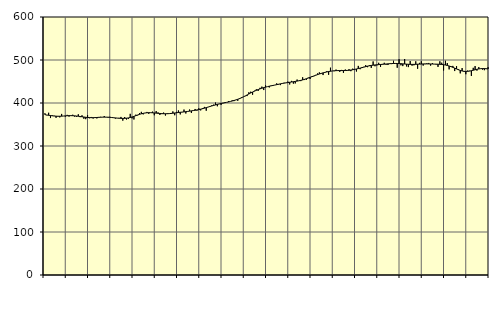
| Category | Piggar | Series 1 |
|---|---|---|
| nan | 376.1 | 372.93 |
| 1.0 | 371.6 | 372.08 |
| 1.0 | 377.3 | 371.46 |
| 1.0 | 365 | 370.79 |
| 1.0 | 371.3 | 370.2 |
| 1.0 | 370.3 | 369.71 |
| 1.0 | 365.6 | 369.36 |
| 1.0 | 368.5 | 369.21 |
| 1.0 | 366.6 | 369.21 |
| 1.0 | 374.6 | 369.39 |
| 1.0 | 369.8 | 369.68 |
| 1.0 | 368.3 | 370.06 |
| nan | 372.4 | 370.38 |
| 2.0 | 368.4 | 370.58 |
| 2.0 | 371.1 | 370.6 |
| 2.0 | 372.7 | 370.45 |
| 2.0 | 368.4 | 370.15 |
| 2.0 | 368.1 | 369.72 |
| 2.0 | 373.7 | 369.2 |
| 2.0 | 367.1 | 368.63 |
| 2.0 | 371.4 | 368.02 |
| 2.0 | 363.4 | 367.39 |
| 2.0 | 362.4 | 366.8 |
| 2.0 | 371.8 | 366.33 |
| nan | 364.6 | 366.01 |
| 3.0 | 367.5 | 365.87 |
| 3.0 | 363.9 | 365.89 |
| 3.0 | 365.9 | 366.05 |
| 3.0 | 364.1 | 366.31 |
| 3.0 | 367.5 | 366.62 |
| 3.0 | 367.8 | 366.88 |
| 3.0 | 366.8 | 367.06 |
| 3.0 | 369.6 | 367.14 |
| 3.0 | 366.8 | 367.11 |
| 3.0 | 366 | 366.99 |
| 3.0 | 367.9 | 366.71 |
| nan | 365.8 | 366.27 |
| 4.0 | 366.3 | 365.79 |
| 4.0 | 363.8 | 365.31 |
| 4.0 | 365.1 | 364.89 |
| 4.0 | 365.3 | 364.54 |
| 4.0 | 367.6 | 364.28 |
| 4.0 | 359 | 364.18 |
| 4.0 | 367.4 | 364.29 |
| 4.0 | 361.6 | 364.66 |
| 4.0 | 362.7 | 365.33 |
| 4.0 | 374.8 | 366.31 |
| 4.0 | 364.3 | 367.54 |
| nan | 361.7 | 369 |
| 5.0 | 372.8 | 370.56 |
| 5.0 | 371.2 | 372.12 |
| 5.0 | 376.7 | 373.6 |
| 5.0 | 379.4 | 374.91 |
| 5.0 | 373.5 | 375.97 |
| 5.0 | 376.7 | 376.76 |
| 5.0 | 379.2 | 377.28 |
| 5.0 | 374.8 | 377.51 |
| 5.0 | 377.7 | 377.48 |
| 5.0 | 379.9 | 377.23 |
| 5.0 | 371.5 | 376.84 |
| nan | 381.2 | 376.42 |
| 6.0 | 378.1 | 376 |
| 6.0 | 372.3 | 375.6 |
| 6.0 | 374.3 | 375.29 |
| 6.0 | 377.7 | 375.06 |
| 6.0 | 370.8 | 374.97 |
| 6.0 | 376.2 | 375.07 |
| 6.0 | 375.4 | 375.31 |
| 6.0 | 374.4 | 375.71 |
| 6.0 | 380.4 | 376.22 |
| 6.0 | 371.5 | 376.78 |
| 6.0 | 379.3 | 377.36 |
| nan | 382.7 | 377.9 |
| 7.0 | 373.5 | 378.4 |
| 7.0 | 378.5 | 378.88 |
| 7.0 | 384.7 | 379.35 |
| 7.0 | 375.6 | 379.86 |
| 7.0 | 380 | 380.42 |
| 7.0 | 384.8 | 381.04 |
| 7.0 | 376.8 | 381.7 |
| 7.0 | 382.6 | 382.39 |
| 7.0 | 386.1 | 383.09 |
| 7.0 | 382.2 | 383.84 |
| 7.0 | 387.7 | 384.7 |
| nan | 382.8 | 385.68 |
| 8.0 | 388 | 386.77 |
| 8.0 | 390.9 | 387.98 |
| 8.0 | 382.1 | 389.25 |
| 8.0 | 390.6 | 390.55 |
| 8.0 | 392.4 | 391.87 |
| 8.0 | 394.6 | 393.15 |
| 8.0 | 396.2 | 394.39 |
| 8.0 | 401 | 395.59 |
| 8.0 | 392.4 | 396.73 |
| 8.0 | 397.6 | 397.79 |
| 8.0 | 395.6 | 398.78 |
| nan | 400.2 | 399.7 |
| 9.0 | 401.6 | 400.6 |
| 9.0 | 401.5 | 401.52 |
| 9.0 | 404.2 | 402.48 |
| 9.0 | 403.6 | 403.51 |
| 9.0 | 406.1 | 404.63 |
| 9.0 | 404.4 | 405.85 |
| 9.0 | 406.9 | 407.17 |
| 9.0 | 405.1 | 408.65 |
| 9.0 | 411.4 | 410.3 |
| 9.0 | 413.4 | 412.15 |
| 9.0 | 413.9 | 414.19 |
| nan | 415.8 | 416.37 |
| 10.0 | 416.1 | 418.64 |
| 10.0 | 424.9 | 420.94 |
| 10.0 | 426.3 | 423.22 |
| 10.0 | 419.2 | 425.42 |
| 10.0 | 428.5 | 427.51 |
| 10.0 | 431.9 | 429.45 |
| 10.0 | 428.1 | 431.24 |
| 10.0 | 435.3 | 432.88 |
| 10.0 | 438 | 434.38 |
| 10.0 | 430.1 | 435.73 |
| 10.0 | 440.9 | 436.95 |
| nan | 437.9 | 438.04 |
| 11.0 | 436.2 | 439.03 |
| 11.0 | 440.6 | 439.93 |
| 11.0 | 440.4 | 440.8 |
| 11.0 | 441.7 | 441.72 |
| 11.0 | 445.7 | 442.68 |
| 11.0 | 442.8 | 443.63 |
| 11.0 | 441.6 | 444.56 |
| 11.0 | 444.9 | 445.41 |
| 11.0 | 447.1 | 446.16 |
| 11.0 | 446.7 | 446.86 |
| 11.0 | 449.8 | 447.52 |
| nan | 443.2 | 448.17 |
| 12.0 | 451.4 | 448.82 |
| 12.0 | 445 | 449.51 |
| 12.0 | 445.5 | 450.22 |
| 12.0 | 454.5 | 450.96 |
| 12.0 | 451.7 | 451.75 |
| 12.0 | 450.9 | 452.64 |
| 12.0 | 459.8 | 453.72 |
| 12.0 | 453.4 | 455.01 |
| 12.0 | 453.9 | 456.44 |
| 12.0 | 458.9 | 458.02 |
| 12.0 | 455.8 | 459.65 |
| nan | 462.4 | 461.26 |
| 13.0 | 462.1 | 462.86 |
| 13.0 | 465.3 | 464.43 |
| 13.0 | 468.7 | 465.96 |
| 13.0 | 471.2 | 467.43 |
| 13.0 | 467.9 | 468.8 |
| 13.0 | 465 | 470.08 |
| 13.0 | 471.7 | 471.24 |
| 13.0 | 473.9 | 472.26 |
| 13.0 | 465.6 | 473.13 |
| 13.0 | 482.1 | 473.87 |
| 13.0 | 474.6 | 474.45 |
| nan | 474 | 474.9 |
| 14.0 | 477.7 | 475.22 |
| 14.0 | 476.2 | 475.39 |
| 14.0 | 472.4 | 475.44 |
| 14.0 | 476.9 | 475.43 |
| 14.0 | 470.1 | 475.43 |
| 14.0 | 477.9 | 475.51 |
| 14.0 | 476.2 | 475.73 |
| 14.0 | 478.7 | 476.1 |
| 14.0 | 474 | 476.66 |
| 14.0 | 479.9 | 477.36 |
| 14.0 | 477 | 478.15 |
| nan | 473.2 | 479.07 |
| 15.0 | 486.3 | 480.06 |
| 15.0 | 478.6 | 481.14 |
| 15.0 | 481.3 | 482.29 |
| 15.0 | 484.1 | 483.45 |
| 15.0 | 488.1 | 484.58 |
| 15.0 | 483.3 | 485.65 |
| 15.0 | 488 | 486.58 |
| 15.0 | 481.6 | 487.37 |
| 15.0 | 496.6 | 487.99 |
| 15.0 | 485.5 | 488.46 |
| 15.0 | 487.5 | 488.88 |
| nan | 493.5 | 489.24 |
| 16.0 | 483.9 | 489.6 |
| 16.0 | 490.8 | 489.97 |
| 16.0 | 493.5 | 490.33 |
| 16.0 | 489 | 490.69 |
| 16.0 | 488.3 | 491.07 |
| 16.0 | 492.1 | 491.4 |
| 16.0 | 490.5 | 491.69 |
| 16.0 | 498.2 | 491.9 |
| 16.0 | 492.7 | 491.96 |
| 16.0 | 482 | 491.89 |
| 16.0 | 501.8 | 491.72 |
| nan | 487.6 | 491.43 |
| 17.0 | 485.8 | 491.05 |
| 17.0 | 502.3 | 490.68 |
| 17.0 | 485.1 | 490.32 |
| 17.0 | 483.5 | 490.01 |
| 17.0 | 497.5 | 489.83 |
| 17.0 | 486.8 | 489.78 |
| 17.0 | 487.7 | 489.84 |
| 17.0 | 496.9 | 489.97 |
| 17.0 | 479.6 | 490.19 |
| 17.0 | 493.3 | 490.44 |
| 17.0 | 497 | 490.66 |
| nan | 487 | 490.84 |
| 18.0 | 490.4 | 490.95 |
| 18.0 | 492.5 | 490.94 |
| 18.0 | 493.1 | 490.84 |
| 18.0 | 486.9 | 490.74 |
| 18.0 | 492.7 | 490.63 |
| 18.0 | 490.3 | 490.5 |
| 18.0 | 489.5 | 490.37 |
| 18.0 | 484 | 490.19 |
| 18.0 | 496.9 | 489.95 |
| 18.0 | 493.7 | 489.61 |
| 18.0 | 475.7 | 489.06 |
| nan | 498.2 | 488.3 |
| 19.0 | 492.9 | 487.31 |
| 19.0 | 478.2 | 486.06 |
| 19.0 | 486 | 484.6 |
| 19.0 | 486.3 | 482.95 |
| 19.0 | 474.3 | 481.12 |
| 19.0 | 485.7 | 479.22 |
| 19.0 | 478.7 | 477.37 |
| 19.0 | 468.9 | 475.75 |
| 19.0 | 481.2 | 474.48 |
| 19.0 | 472.7 | 473.66 |
| 19.0 | 466.9 | 473.38 |
| nan | 475.5 | 473.59 |
| 20.0 | 475 | 474.18 |
| 20.0 | 462.9 | 475.09 |
| 20.0 | 481.8 | 476.21 |
| 20.0 | 485.9 | 477.35 |
| 20.0 | 475.3 | 478.4 |
| 20.0 | 483.5 | 479.26 |
| 20.0 | 480.2 | 479.81 |
| 20.0 | 477.7 | 480.07 |
| 20.0 | 476.3 | 480.02 |
| 20.0 | 480.5 | 479.68 |
| 20.0 | 483.2 | 479.16 |